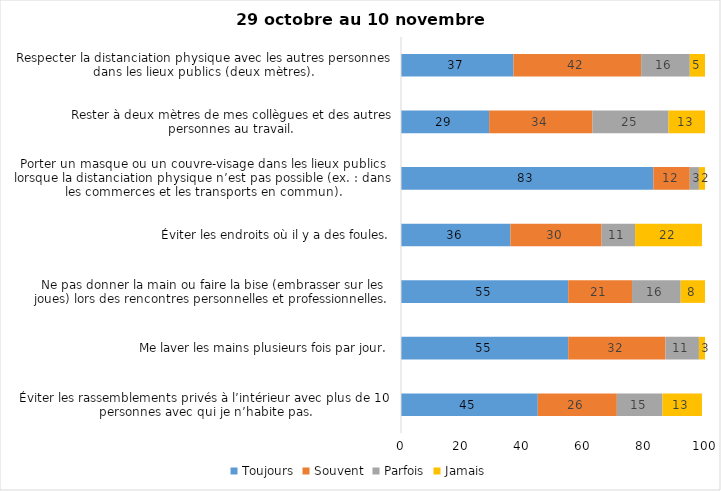
| Category | Toujours | Souvent | Parfois | Jamais |
|---|---|---|---|---|
| Éviter les rassemblements privés à l’intérieur avec plus de 10 personnes avec qui je n’habite pas. | 45 | 26 | 15 | 13 |
| Me laver les mains plusieurs fois par jour. | 55 | 32 | 11 | 3 |
| Ne pas donner la main ou faire la bise (embrasser sur les joues) lors des rencontres personnelles et professionnelles. | 55 | 21 | 16 | 8 |
| Éviter les endroits où il y a des foules. | 36 | 30 | 11 | 22 |
| Porter un masque ou un couvre-visage dans les lieux publics lorsque la distanciation physique n’est pas possible (ex. : dans les commerces et les transports en commun). | 83 | 12 | 3 | 2 |
| Rester à deux mètres de mes collègues et des autres personnes au travail. | 29 | 34 | 25 | 13 |
| Respecter la distanciation physique avec les autres personnes dans les lieux publics (deux mètres). | 37 | 42 | 16 | 5 |